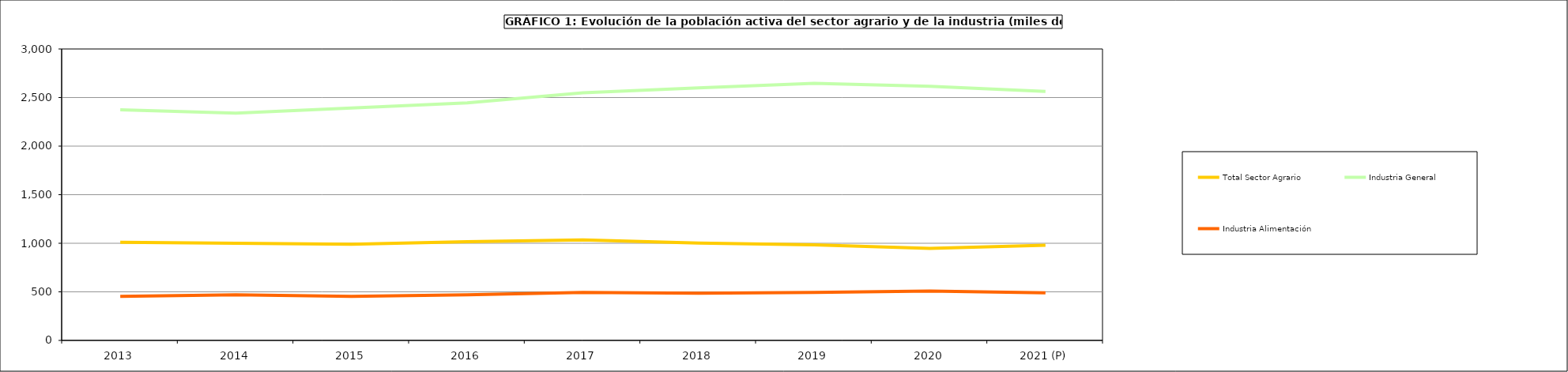
| Category | Total Sector Agrario | Industria General | Industria Alimentación |
|---|---|---|---|
| 2013 | 1010.5 | 2372.975 | 454.075 |
| 2014 | 1000.9 | 2339.7 | 468.5 |
| 2015 | 990.325 | 2391.725 | 454.1 |
| 2016 | 1016.75 | 2445.73 | 468.93 |
| 2017 | 1034 | 2548.2 | 494.3 |
| 2018 | 1002.675 | 2599.175 | 485.3 |
| 2019 | 983.3 | 2646.575 | 493.625 |
| 2020 | 946.55 | 2616.825 | 508.925 |
| 2021 (P) | 979.85 | 2563.525 | 490.375 |